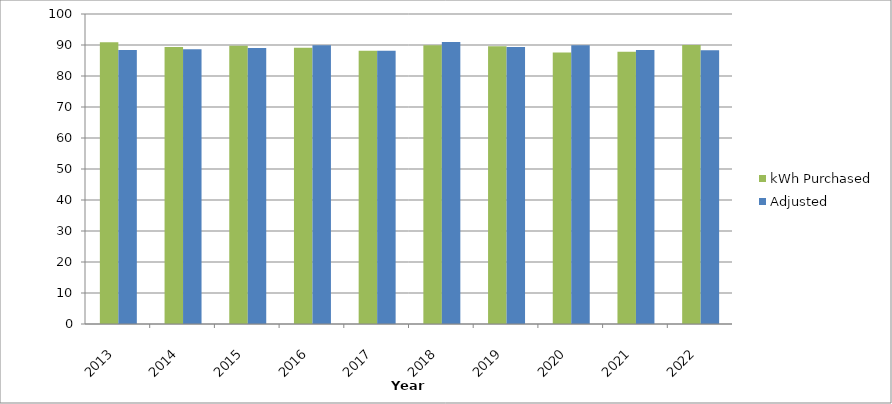
| Category | kWh Purchased | Adjusted |
|---|---|---|
| 2013.0 | 90874156.26 | 88366010.048 |
| 2014.0 | 89376615.26 | 88661685.778 |
| 2015.0 | 89768282.26 | 89010777.472 |
| 2016.0 | 89085775.26 | 89934682.746 |
| 2017.0 | 88171491.93 | 88121279.395 |
| 2018.0 | 89884663.68 | 90935675.293 |
| 2019.0 | 89565183.47 | 89315411.477 |
| 2020.0 | 87584142.184 | 89937807.73 |
| 2021.0 | 87828569.654 | 88405826.871 |
| 2022.0 | 90017844.81 | 88301617.958 |